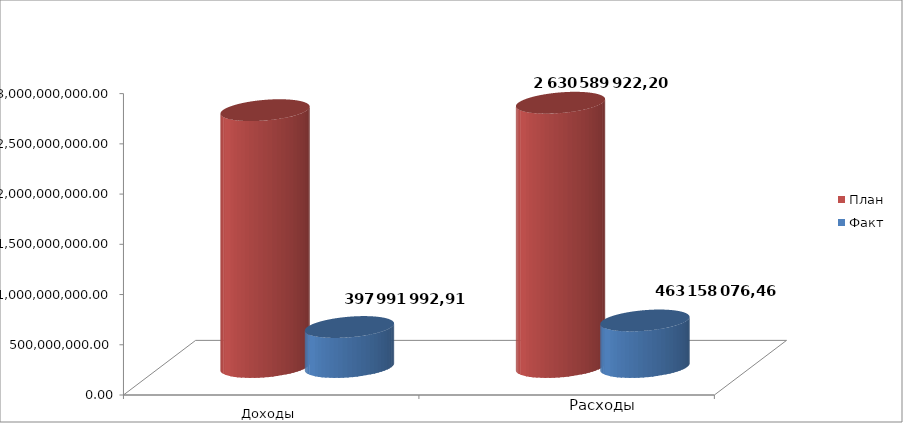
| Category | План | Факт |
|---|---|---|
| 0 | 2556607380.22 | 397991992.91 |
| 1 | 2630589922.2 | 463158076.46 |